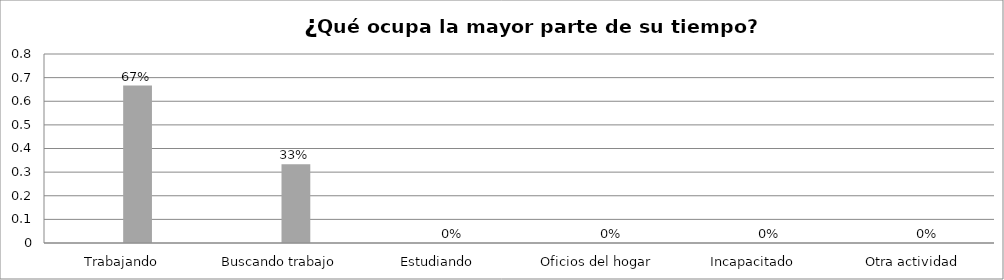
| Category | Series 0 | Series 1 | Series 2 | Series 3 |
|---|---|---|---|---|
| Trabajando |  |  | 0.667 |  |
| Buscando trabajo |  |  | 0.333 |  |
| Estudiando |  |  | 0 |  |
| Oficios del hogar |  |  | 0 |  |
| Incapacitado  |  |  | 0 |  |
| Otra actividad |  |  | 0 |  |